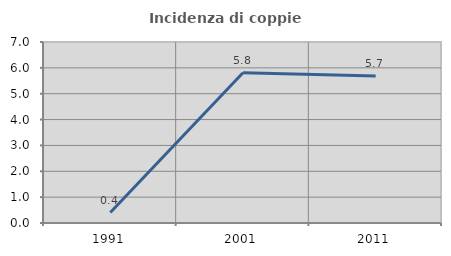
| Category | Incidenza di coppie miste |
|---|---|
| 1991.0 | 0.405 |
| 2001.0 | 5.814 |
| 2011.0 | 5.686 |